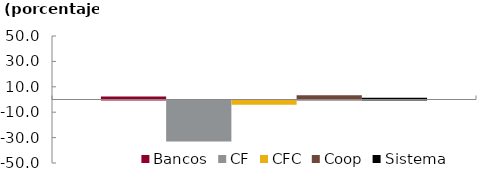
| Category | Bancos | CF | CFC | Coop | Sistema |
|---|---|---|---|---|---|
|  | 2.44 | -32.252 | -3.365 | 3.262 | 1.291 |